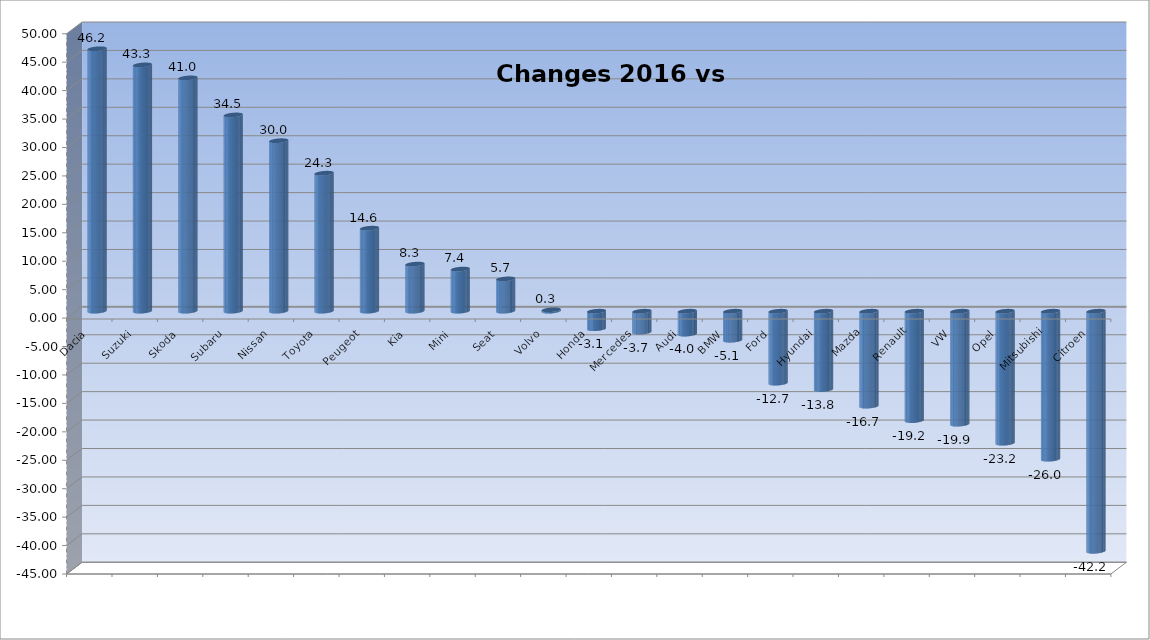
| Category | Ytd 2015 |
|---|---|
| Dacia | 46.154 |
| Suzuki | 43.312 |
| Skoda | 41.028 |
| Subaru | 34.513 |
| Nissan | 29.982 |
| Toyota | 24.269 |
| Peugeot | 14.604 |
| Kia | 8.283 |
| Mini | 7.407 |
| Seat | 5.685 |
| Volvo | 0.254 |
| Honda | -3.084 |
| Mercedes | -3.692 |
| Audi | -4.032 |
| BMW | -5.114 |
| Ford | -12.66 |
| Hyundai | -13.781 |
| Mazda | -16.701 |
| Renault | -19.238 |
| VW | -19.869 |
| Opel | -23.218 |
| Mitsubishi | -26.027 |
| Citroen | -42.222 |